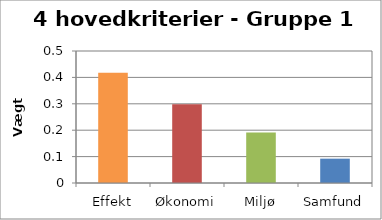
| Category | Vægt 1 |
|---|---|
| Effekt | 0.418 |
| Økonomi | 0.299 |
| Miljø | 0.191 |
| Samfund | 0.092 |